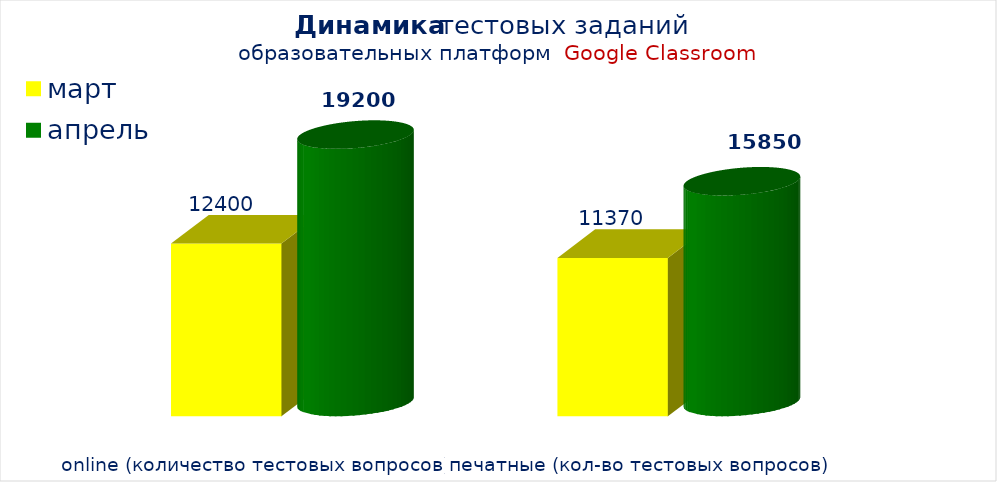
| Category | март | апрель |
|---|---|---|
| online (количество тестовых вопросов) | 12400 | 19200 |
| печатные (кол-во тестовых вопросов) | 11370 | 15850 |